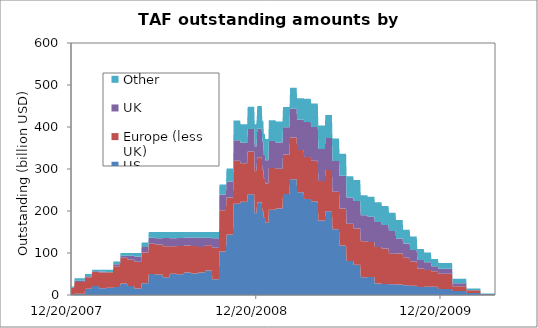
| Category | US | Europe (less UK) | UK | Other |
|---|---|---|---|---|
| 12/20/07 | 1.045 | 15.984 | 0.206 | 2.765 |
| 12/21/07 | 1.045 | 15.984 | 0.206 | 2.765 |
| 12/22/07 | 1.045 | 15.984 | 0.206 | 2.765 |
| 12/23/07 | 1.045 | 15.984 | 0.206 | 2.765 |
| 12/24/07 | 1.045 | 15.984 | 0.206 | 2.765 |
| 12/25/07 | 1.045 | 15.984 | 0.206 | 2.765 |
| 12/26/07 | 1.045 | 15.984 | 0.206 | 2.765 |
| 12/27/07 | 2.973 | 28.252 | 2.506 | 6.27 |
| 12/28/07 | 2.973 | 28.252 | 2.506 | 6.27 |
| 12/29/07 | 2.973 | 28.252 | 2.506 | 6.27 |
| 12/30/07 | 2.973 | 28.252 | 2.506 | 6.27 |
| 12/31/07 | 2.973 | 28.252 | 2.506 | 6.27 |
| 1/1/08 | 2.973 | 28.252 | 2.506 | 6.27 |
| 1/2/08 | 2.973 | 28.252 | 2.506 | 6.27 |
| 1/3/08 | 2.973 | 28.252 | 2.506 | 6.27 |
| 1/4/08 | 2.973 | 28.252 | 2.506 | 6.27 |
| 1/5/08 | 2.973 | 28.252 | 2.506 | 6.27 |
| 1/6/08 | 2.973 | 28.252 | 2.506 | 6.27 |
| 1/7/08 | 2.973 | 28.252 | 2.506 | 6.27 |
| 1/8/08 | 2.973 | 28.252 | 2.506 | 6.27 |
| 1/9/08 | 2.973 | 28.252 | 2.506 | 6.27 |
| 1/10/08 | 2.973 | 28.252 | 2.506 | 6.27 |
| 1/11/08 | 2.973 | 28.252 | 2.506 | 6.27 |
| 1/12/08 | 2.973 | 28.252 | 2.506 | 6.27 |
| 1/13/08 | 2.973 | 28.252 | 2.506 | 6.27 |
| 1/14/08 | 2.973 | 28.252 | 2.506 | 6.27 |
| 1/15/08 | 2.973 | 28.252 | 2.506 | 6.27 |
| 1/16/08 | 2.973 | 28.252 | 2.506 | 6.27 |
| 1/17/08 | 14.746 | 27.387 | 2.3 | 5.566 |
| 1/18/08 | 14.746 | 27.387 | 2.3 | 5.566 |
| 1/19/08 | 14.746 | 27.387 | 2.3 | 5.566 |
| 1/20/08 | 14.746 | 27.387 | 2.3 | 5.566 |
| 1/21/08 | 14.746 | 27.387 | 2.3 | 5.566 |
| 1/22/08 | 14.746 | 27.387 | 2.3 | 5.566 |
| 1/23/08 | 14.746 | 27.387 | 2.3 | 5.566 |
| 1/24/08 | 14.746 | 27.387 | 2.3 | 5.566 |
| 1/25/08 | 14.746 | 27.387 | 2.3 | 5.566 |
| 1/26/08 | 14.746 | 27.387 | 2.3 | 5.566 |
| 1/27/08 | 14.746 | 27.387 | 2.3 | 5.566 |
| 1/28/08 | 14.746 | 27.387 | 2.3 | 5.566 |
| 1/29/08 | 14.746 | 27.387 | 2.3 | 5.566 |
| 1/30/08 | 14.746 | 27.387 | 2.3 | 5.566 |
| 1/31/08 | 21.15 | 33.418 | 2.01 | 3.421 |
| 2/1/08 | 21.15 | 33.418 | 2.01 | 3.421 |
| 2/2/08 | 21.15 | 33.418 | 2.01 | 3.421 |
| 2/3/08 | 21.15 | 33.418 | 2.01 | 3.421 |
| 2/4/08 | 21.15 | 33.418 | 2.01 | 3.421 |
| 2/5/08 | 21.15 | 33.418 | 2.01 | 3.421 |
| 2/6/08 | 21.15 | 33.418 | 2.01 | 3.421 |
| 2/7/08 | 21.15 | 33.418 | 2.01 | 3.421 |
| 2/8/08 | 21.15 | 33.418 | 2.01 | 3.421 |
| 2/9/08 | 21.15 | 33.418 | 2.01 | 3.421 |
| 2/10/08 | 21.15 | 33.418 | 2.01 | 3.421 |
| 2/11/08 | 21.15 | 33.418 | 2.01 | 3.421 |
| 2/12/08 | 21.15 | 33.418 | 2.01 | 3.421 |
| 2/13/08 | 21.15 | 33.418 | 2.01 | 3.421 |
| 2/14/08 | 16.268 | 37.562 | 2.01 | 4.16 |
| 2/15/08 | 16.268 | 37.562 | 2.01 | 4.16 |
| 2/16/08 | 16.268 | 37.562 | 2.01 | 4.16 |
| 2/17/08 | 16.268 | 37.562 | 2.01 | 4.16 |
| 2/18/08 | 16.268 | 37.562 | 2.01 | 4.16 |
| 2/19/08 | 16.268 | 37.562 | 2.01 | 4.16 |
| 2/20/08 | 16.268 | 37.562 | 2.01 | 4.16 |
| 2/21/08 | 16.268 | 37.562 | 2.01 | 4.16 |
| 2/22/08 | 16.268 | 37.562 | 2.01 | 4.16 |
| 2/23/08 | 16.268 | 37.562 | 2.01 | 4.16 |
| 2/24/08 | 16.268 | 37.562 | 2.01 | 4.16 |
| 2/25/08 | 16.268 | 37.562 | 2.01 | 4.16 |
| 2/26/08 | 16.268 | 37.562 | 2.01 | 4.16 |
| 2/27/08 | 16.268 | 37.562 | 2.01 | 4.16 |
| 2/28/08 | 17.058 | 37.132 | 0.21 | 5.6 |
| 2/29/08 | 17.058 | 37.132 | 0.21 | 5.6 |
| 3/1/08 | 17.058 | 37.132 | 0.21 | 5.6 |
| 3/2/08 | 17.058 | 37.132 | 0.21 | 5.6 |
| 3/3/08 | 17.058 | 37.132 | 0.21 | 5.6 |
| 3/4/08 | 17.058 | 37.132 | 0.21 | 5.6 |
| 3/5/08 | 17.058 | 37.132 | 0.21 | 5.6 |
| 3/6/08 | 17.058 | 37.132 | 0.21 | 5.6 |
| 3/7/08 | 17.058 | 37.132 | 0.21 | 5.6 |
| 3/8/08 | 17.058 | 37.132 | 0.21 | 5.6 |
| 3/9/08 | 17.058 | 37.132 | 0.21 | 5.6 |
| 3/10/08 | 17.058 | 37.132 | 0.21 | 5.6 |
| 3/11/08 | 17.058 | 37.132 | 0.21 | 5.6 |
| 3/12/08 | 17.058 | 37.132 | 0.21 | 5.6 |
| 3/13/08 | 19.18 | 49.51 | 4.46 | 6.85 |
| 3/14/08 | 19.18 | 49.51 | 4.46 | 6.85 |
| 3/15/08 | 19.18 | 49.51 | 4.46 | 6.85 |
| 3/16/08 | 19.18 | 49.51 | 4.46 | 6.85 |
| 3/17/08 | 19.18 | 49.51 | 4.46 | 6.85 |
| 3/18/08 | 19.18 | 49.51 | 4.46 | 6.85 |
| 3/19/08 | 19.18 | 49.51 | 4.46 | 6.85 |
| 3/20/08 | 19.18 | 49.51 | 4.46 | 6.85 |
| 3/21/08 | 19.18 | 49.51 | 4.46 | 6.85 |
| 3/22/08 | 19.18 | 49.51 | 4.46 | 6.85 |
| 3/23/08 | 19.18 | 49.51 | 4.46 | 6.85 |
| 3/24/08 | 19.18 | 49.51 | 4.46 | 6.85 |
| 3/25/08 | 19.18 | 49.51 | 4.46 | 6.85 |
| 3/26/08 | 19.18 | 49.51 | 4.46 | 6.85 |
| 3/27/08 | 27.183 | 61.583 | 4.85 | 6.385 |
| 3/28/08 | 27.183 | 61.583 | 4.85 | 6.385 |
| 3/29/08 | 27.183 | 61.583 | 4.85 | 6.385 |
| 3/30/08 | 27.183 | 61.583 | 4.85 | 6.385 |
| 3/31/08 | 27.183 | 61.583 | 4.85 | 6.385 |
| 4/1/08 | 27.183 | 61.583 | 4.85 | 6.385 |
| 4/2/08 | 27.183 | 61.583 | 4.85 | 6.385 |
| 4/3/08 | 27.183 | 61.583 | 4.85 | 6.385 |
| 4/4/08 | 27.183 | 61.583 | 4.85 | 6.385 |
| 4/5/08 | 27.183 | 61.583 | 4.85 | 6.385 |
| 4/6/08 | 27.183 | 61.583 | 4.85 | 6.385 |
| 4/7/08 | 27.183 | 61.583 | 4.85 | 6.385 |
| 4/8/08 | 27.183 | 61.583 | 4.85 | 6.385 |
| 4/9/08 | 27.183 | 61.583 | 4.85 | 6.385 |
| 4/10/08 | 21.679 | 62.866 | 9 | 6.455 |
| 4/11/08 | 21.679 | 62.866 | 9 | 6.455 |
| 4/12/08 | 21.679 | 62.866 | 9 | 6.455 |
| 4/13/08 | 21.679 | 62.866 | 9 | 6.455 |
| 4/14/08 | 21.679 | 62.866 | 9 | 6.455 |
| 4/15/08 | 21.679 | 62.866 | 9 | 6.455 |
| 4/16/08 | 21.679 | 62.866 | 9 | 6.455 |
| 4/17/08 | 21.679 | 62.866 | 9 | 6.455 |
| 4/18/08 | 21.679 | 62.866 | 9 | 6.455 |
| 4/19/08 | 21.679 | 62.866 | 9 | 6.455 |
| 4/20/08 | 21.679 | 62.866 | 9 | 6.455 |
| 4/21/08 | 21.679 | 62.866 | 9 | 6.455 |
| 4/22/08 | 21.679 | 62.866 | 9 | 6.455 |
| 4/23/08 | 21.679 | 62.866 | 9 | 6.455 |
| 4/24/08 | 15.5 | 63.524 | 12.55 | 8.426 |
| 4/25/08 | 15.5 | 63.524 | 12.55 | 8.426 |
| 4/26/08 | 15.5 | 63.524 | 12.55 | 8.426 |
| 4/27/08 | 15.5 | 63.524 | 12.55 | 8.426 |
| 4/28/08 | 15.5 | 63.524 | 12.55 | 8.426 |
| 4/29/08 | 15.5 | 63.524 | 12.55 | 8.426 |
| 4/30/08 | 15.5 | 63.524 | 12.55 | 8.426 |
| 5/1/08 | 15.5 | 63.524 | 12.55 | 8.426 |
| 5/2/08 | 15.5 | 63.524 | 12.55 | 8.426 |
| 5/3/08 | 15.5 | 63.524 | 12.55 | 8.426 |
| 5/4/08 | 15.5 | 63.524 | 12.55 | 8.426 |
| 5/5/08 | 15.5 | 63.524 | 12.55 | 8.426 |
| 5/6/08 | 15.5 | 63.524 | 12.55 | 8.426 |
| 5/7/08 | 15.5 | 63.524 | 12.55 | 8.426 |
| 5/8/08 | 27.78 | 73.433 | 13.36 | 10.426 |
| 5/9/08 | 27.78 | 73.433 | 13.36 | 10.426 |
| 5/10/08 | 27.78 | 73.433 | 13.36 | 10.426 |
| 5/11/08 | 27.78 | 73.433 | 13.36 | 10.426 |
| 5/12/08 | 27.78 | 73.433 | 13.36 | 10.426 |
| 5/13/08 | 27.78 | 73.433 | 13.36 | 10.426 |
| 5/14/08 | 27.78 | 73.433 | 13.36 | 10.426 |
| 5/15/08 | 27.78 | 73.433 | 13.36 | 10.426 |
| 5/16/08 | 27.78 | 73.433 | 13.36 | 10.426 |
| 5/17/08 | 27.78 | 73.433 | 13.36 | 10.426 |
| 5/18/08 | 27.78 | 73.433 | 13.36 | 10.426 |
| 5/19/08 | 27.78 | 73.433 | 13.36 | 10.426 |
| 5/20/08 | 27.78 | 73.433 | 13.36 | 10.426 |
| 5/21/08 | 27.78 | 73.433 | 13.36 | 10.426 |
| 5/22/08 | 49.861 | 72.036 | 14.222 | 13.88 |
| 5/23/08 | 49.861 | 72.036 | 14.222 | 13.88 |
| 5/24/08 | 49.861 | 72.036 | 14.222 | 13.88 |
| 5/25/08 | 49.861 | 72.036 | 14.222 | 13.88 |
| 5/26/08 | 49.861 | 72.036 | 14.222 | 13.88 |
| 5/27/08 | 49.861 | 72.036 | 14.222 | 13.88 |
| 5/28/08 | 49.861 | 72.036 | 14.222 | 13.88 |
| 5/29/08 | 49.861 | 72.036 | 14.222 | 13.88 |
| 5/30/08 | 49.861 | 72.036 | 14.222 | 13.88 |
| 5/31/08 | 49.861 | 72.036 | 14.222 | 13.88 |
| 6/1/08 | 49.861 | 72.036 | 14.222 | 13.88 |
| 6/2/08 | 49.861 | 72.036 | 14.222 | 13.88 |
| 6/3/08 | 49.861 | 72.036 | 14.222 | 13.88 |
| 6/4/08 | 49.861 | 72.036 | 14.222 | 13.88 |
| 6/5/08 | 48.658 | 71.869 | 14.862 | 14.61 |
| 6/6/08 | 48.658 | 71.869 | 14.862 | 14.61 |
| 6/7/08 | 48.658 | 71.869 | 14.862 | 14.61 |
| 6/8/08 | 48.658 | 71.869 | 14.862 | 14.61 |
| 6/9/08 | 48.658 | 71.869 | 14.862 | 14.61 |
| 6/10/08 | 48.658 | 71.869 | 14.862 | 14.61 |
| 6/11/08 | 48.658 | 71.869 | 14.862 | 14.61 |
| 6/12/08 | 48.658 | 71.869 | 14.862 | 14.61 |
| 6/13/08 | 48.658 | 71.869 | 14.862 | 14.61 |
| 6/14/08 | 48.658 | 71.869 | 14.862 | 14.61 |
| 6/15/08 | 48.658 | 71.869 | 14.862 | 14.61 |
| 6/16/08 | 48.658 | 71.869 | 14.862 | 14.61 |
| 6/17/08 | 48.658 | 71.869 | 14.862 | 14.61 |
| 6/18/08 | 48.658 | 71.869 | 14.862 | 14.61 |
| 6/19/08 | 42.095 | 74.027 | 19.578 | 14.3 |
| 6/20/08 | 42.095 | 74.027 | 19.578 | 14.3 |
| 6/21/08 | 42.095 | 74.027 | 19.578 | 14.3 |
| 6/22/08 | 42.095 | 74.027 | 19.578 | 14.3 |
| 6/23/08 | 42.095 | 74.027 | 19.578 | 14.3 |
| 6/24/08 | 42.095 | 74.027 | 19.578 | 14.3 |
| 6/25/08 | 42.095 | 74.027 | 19.578 | 14.3 |
| 6/26/08 | 42.095 | 74.027 | 19.578 | 14.3 |
| 6/27/08 | 42.095 | 74.027 | 19.578 | 14.3 |
| 6/28/08 | 42.095 | 74.027 | 19.578 | 14.3 |
| 6/29/08 | 42.095 | 74.027 | 19.578 | 14.3 |
| 6/30/08 | 42.095 | 74.027 | 19.578 | 14.3 |
| 7/1/08 | 42.095 | 74.027 | 19.578 | 14.3 |
| 7/2/08 | 42.095 | 74.027 | 19.578 | 14.3 |
| 7/3/08 | 50.309 | 65.793 | 19.118 | 14.78 |
| 7/4/08 | 50.309 | 65.793 | 19.118 | 14.78 |
| 7/5/08 | 50.309 | 65.793 | 19.118 | 14.78 |
| 7/6/08 | 50.309 | 65.793 | 19.118 | 14.78 |
| 7/7/08 | 50.309 | 65.793 | 19.118 | 14.78 |
| 7/8/08 | 50.309 | 65.793 | 19.118 | 14.78 |
| 7/9/08 | 50.309 | 65.793 | 19.118 | 14.78 |
| 7/10/08 | 50.309 | 65.793 | 19.118 | 14.78 |
| 7/11/08 | 50.309 | 65.793 | 19.118 | 14.78 |
| 7/12/08 | 50.309 | 65.793 | 19.118 | 14.78 |
| 7/13/08 | 50.309 | 65.793 | 19.118 | 14.78 |
| 7/14/08 | 50.309 | 65.793 | 19.118 | 14.78 |
| 7/15/08 | 50.309 | 65.793 | 19.118 | 14.78 |
| 7/16/08 | 50.309 | 65.793 | 19.118 | 14.78 |
| 7/17/08 | 49.388 | 67.172 | 19.4 | 14.04 |
| 7/18/08 | 49.388 | 67.172 | 19.4 | 14.04 |
| 7/19/08 | 49.388 | 67.172 | 19.4 | 14.04 |
| 7/20/08 | 49.388 | 67.172 | 19.4 | 14.04 |
| 7/21/08 | 49.388 | 67.172 | 19.4 | 14.04 |
| 7/22/08 | 49.388 | 67.172 | 19.4 | 14.04 |
| 7/23/08 | 49.388 | 67.172 | 19.4 | 14.04 |
| 7/24/08 | 49.388 | 67.172 | 19.4 | 14.04 |
| 7/25/08 | 49.388 | 67.172 | 19.4 | 14.04 |
| 7/26/08 | 49.388 | 67.172 | 19.4 | 14.04 |
| 7/27/08 | 49.388 | 67.172 | 19.4 | 14.04 |
| 7/28/08 | 49.388 | 67.172 | 19.4 | 14.04 |
| 7/29/08 | 49.388 | 67.172 | 19.4 | 14.04 |
| 7/30/08 | 49.388 | 67.172 | 19.4 | 14.04 |
| 7/31/08 | 53.574 | 64.122 | 19.264 | 13.04 |
| 8/1/08 | 53.574 | 64.122 | 19.264 | 13.04 |
| 8/2/08 | 53.574 | 64.122 | 19.264 | 13.04 |
| 8/3/08 | 53.574 | 64.122 | 19.264 | 13.04 |
| 8/4/08 | 53.574 | 64.122 | 19.264 | 13.04 |
| 8/5/08 | 53.574 | 64.122 | 19.264 | 13.04 |
| 8/6/08 | 53.574 | 64.122 | 19.264 | 13.04 |
| 8/7/08 | 53.574 | 64.122 | 19.264 | 13.04 |
| 8/8/08 | 53.574 | 64.122 | 19.264 | 13.04 |
| 8/9/08 | 53.574 | 64.122 | 19.264 | 13.04 |
| 8/10/08 | 53.574 | 64.122 | 19.264 | 13.04 |
| 8/11/08 | 53.574 | 64.122 | 19.264 | 13.04 |
| 8/12/08 | 53.574 | 64.122 | 19.264 | 13.04 |
| 8/13/08 | 53.574 | 64.122 | 19.264 | 13.04 |
| 8/14/08 | 51.364 | 65.114 | 20.442 | 13.08 |
| 8/15/08 | 51.364 | 65.114 | 20.442 | 13.08 |
| 8/16/08 | 51.364 | 65.114 | 20.442 | 13.08 |
| 8/17/08 | 51.364 | 65.114 | 20.442 | 13.08 |
| 8/18/08 | 51.364 | 65.114 | 20.442 | 13.08 |
| 8/19/08 | 51.364 | 65.114 | 20.442 | 13.08 |
| 8/20/08 | 51.364 | 65.114 | 20.442 | 13.08 |
| 8/21/08 | 51.364 | 65.114 | 20.442 | 13.08 |
| 8/22/08 | 51.364 | 65.114 | 20.442 | 13.08 |
| 8/23/08 | 51.364 | 65.114 | 20.442 | 13.08 |
| 8/24/08 | 51.364 | 65.114 | 20.442 | 13.08 |
| 8/25/08 | 51.364 | 65.114 | 20.442 | 13.08 |
| 8/26/08 | 51.364 | 65.114 | 20.442 | 13.08 |
| 8/27/08 | 51.364 | 65.114 | 20.442 | 13.08 |
| 8/28/08 | 53.677 | 60.43 | 21.988 | 13.905 |
| 8/29/08 | 53.677 | 60.43 | 21.988 | 13.905 |
| 8/30/08 | 53.677 | 60.43 | 21.988 | 13.905 |
| 8/31/08 | 53.677 | 60.43 | 21.988 | 13.905 |
| 9/1/08 | 53.677 | 60.43 | 21.988 | 13.905 |
| 9/2/08 | 53.677 | 60.43 | 21.988 | 13.905 |
| 9/3/08 | 53.677 | 60.43 | 21.988 | 13.905 |
| 9/4/08 | 53.677 | 60.43 | 21.988 | 13.905 |
| 9/5/08 | 53.677 | 60.43 | 21.988 | 13.905 |
| 9/6/08 | 53.677 | 60.43 | 21.988 | 13.905 |
| 9/7/08 | 53.677 | 60.43 | 21.988 | 13.905 |
| 9/8/08 | 53.677 | 60.43 | 21.988 | 13.905 |
| 9/9/08 | 53.677 | 60.43 | 21.988 | 13.905 |
| 9/10/08 | 53.677 | 60.43 | 21.988 | 13.905 |
| 9/11/08 | 58.205 | 60.28 | 17.9 | 13.615 |
| 9/12/08 | 58.205 | 60.28 | 17.9 | 13.615 |
| 9/13/08 | 58.205 | 60.28 | 17.9 | 13.615 |
| 9/14/08 | 58.205 | 60.28 | 17.9 | 13.615 |
| 9/15/08 | 58.205 | 60.28 | 17.9 | 13.615 |
| 9/16/08 | 58.205 | 60.28 | 17.9 | 13.615 |
| 9/17/08 | 58.205 | 60.28 | 17.9 | 13.615 |
| 9/18/08 | 58.205 | 60.28 | 17.9 | 13.615 |
| 9/19/08 | 58.205 | 60.28 | 17.9 | 13.615 |
| 9/20/08 | 58.205 | 60.28 | 17.9 | 13.615 |
| 9/21/08 | 58.205 | 60.28 | 17.9 | 13.615 |
| 9/22/08 | 58.205 | 60.28 | 17.9 | 13.615 |
| 9/23/08 | 58.205 | 60.28 | 17.9 | 13.615 |
| 9/24/08 | 58.205 | 60.28 | 17.9 | 13.615 |
| 9/25/08 | 37.665 | 75 | 22.162 | 15.173 |
| 9/26/08 | 37.665 | 75 | 22.162 | 15.173 |
| 9/27/08 | 37.665 | 75 | 22.162 | 15.173 |
| 9/28/08 | 37.665 | 75 | 22.162 | 15.173 |
| 9/29/08 | 37.665 | 75 | 22.162 | 15.173 |
| 9/30/08 | 37.665 | 75 | 22.162 | 15.173 |
| 10/1/08 | 37.665 | 75 | 22.162 | 15.173 |
| 10/2/08 | 37.665 | 75 | 22.162 | 15.173 |
| 10/3/08 | 37.665 | 75 | 22.162 | 15.173 |
| 10/4/08 | 37.665 | 75 | 22.162 | 15.173 |
| 10/5/08 | 37.665 | 75 | 22.162 | 15.173 |
| 10/6/08 | 37.665 | 75 | 22.162 | 15.173 |
| 10/7/08 | 37.665 | 75 | 22.162 | 15.173 |
| 10/8/08 | 37.665 | 75 | 22.162 | 15.173 |
| 10/9/08 | 103.707 | 97.8 | 37.562 | 24.023 |
| 10/10/08 | 103.707 | 97.8 | 37.562 | 24.023 |
| 10/11/08 | 103.707 | 97.8 | 37.562 | 24.023 |
| 10/12/08 | 103.707 | 97.8 | 37.562 | 24.023 |
| 10/13/08 | 103.707 | 97.8 | 37.562 | 24.023 |
| 10/14/08 | 103.707 | 97.8 | 37.562 | 24.023 |
| 10/15/08 | 103.707 | 97.8 | 37.562 | 24.023 |
| 10/16/08 | 103.707 | 97.8 | 37.562 | 24.023 |
| 10/17/08 | 103.707 | 97.8 | 37.562 | 24.023 |
| 10/18/08 | 103.707 | 97.8 | 37.562 | 24.023 |
| 10/19/08 | 103.707 | 97.8 | 37.562 | 24.023 |
| 10/20/08 | 103.707 | 97.8 | 37.562 | 24.023 |
| 10/21/08 | 103.707 | 97.8 | 37.562 | 24.023 |
| 10/22/08 | 103.707 | 97.8 | 37.562 | 24.023 |
| 10/23/08 | 144.184 | 88.055 | 37.91 | 31.213 |
| 10/24/08 | 144.184 | 88.055 | 37.91 | 31.213 |
| 10/25/08 | 144.184 | 88.055 | 37.91 | 31.213 |
| 10/26/08 | 144.184 | 88.055 | 37.91 | 31.213 |
| 10/27/08 | 144.184 | 88.055 | 37.91 | 31.213 |
| 10/28/08 | 144.184 | 88.055 | 37.91 | 31.213 |
| 10/29/08 | 144.184 | 88.055 | 37.91 | 31.213 |
| 10/30/08 | 144.184 | 88.055 | 37.91 | 31.213 |
| 10/31/08 | 144.184 | 88.055 | 37.91 | 31.213 |
| 11/1/08 | 144.184 | 88.055 | 37.91 | 31.213 |
| 11/2/08 | 144.184 | 88.055 | 37.91 | 31.213 |
| 11/3/08 | 144.184 | 88.055 | 37.91 | 31.213 |
| 11/4/08 | 144.184 | 88.055 | 37.91 | 31.213 |
| 11/5/08 | 144.184 | 88.055 | 37.91 | 31.213 |
| 11/6/08 | 217.339 | 102.125 | 49.12 | 46.718 |
| 11/7/08 | 217.339 | 102.125 | 49.12 | 46.718 |
| 11/8/08 | 217.339 | 102.125 | 49.12 | 46.718 |
| 11/9/08 | 217.339 | 102.125 | 49.12 | 46.718 |
| 11/10/08 | 217.339 | 102.125 | 49.12 | 46.718 |
| 11/11/08 | 217.339 | 102.125 | 49.12 | 46.718 |
| 11/12/08 | 217.339 | 102.125 | 49.12 | 46.718 |
| 11/13/08 | 217.339 | 102.125 | 49.12 | 46.718 |
| 11/14/08 | 217.339 | 102.125 | 49.12 | 46.718 |
| 11/15/08 | 217.339 | 102.125 | 49.12 | 46.718 |
| 11/16/08 | 217.339 | 102.125 | 49.12 | 46.718 |
| 11/17/08 | 217.339 | 102.125 | 49.12 | 46.718 |
| 11/18/08 | 217.339 | 102.125 | 49.12 | 46.718 |
| 11/19/08 | 217.339 | 102.125 | 49.12 | 46.718 |
| 11/20/08 | 221.873 | 91.975 | 48.62 | 44.04 |
| 11/21/08 | 221.873 | 91.975 | 48.62 | 44.04 |
| 11/22/08 | 221.873 | 91.975 | 48.62 | 44.04 |
| 11/23/08 | 221.873 | 91.975 | 48.62 | 44.04 |
| 11/24/08 | 221.873 | 91.975 | 48.62 | 44.04 |
| 11/25/08 | 221.873 | 91.975 | 48.62 | 44.04 |
| 11/26/08 | 221.873 | 91.975 | 48.62 | 44.04 |
| 11/27/08 | 221.873 | 91.975 | 48.62 | 44.04 |
| 11/28/08 | 221.873 | 91.975 | 48.62 | 44.04 |
| 11/29/08 | 221.873 | 91.975 | 48.62 | 44.04 |
| 11/30/08 | 221.873 | 91.975 | 48.62 | 44.04 |
| 12/1/08 | 221.873 | 91.975 | 48.62 | 44.04 |
| 12/2/08 | 221.873 | 91.975 | 48.62 | 44.04 |
| 12/3/08 | 221.873 | 91.975 | 48.62 | 44.04 |
| 12/4/08 | 239.679 | 101.925 | 53.52 | 52.855 |
| 12/5/08 | 239.679 | 101.925 | 53.52 | 52.855 |
| 12/6/08 | 239.679 | 101.925 | 53.52 | 52.855 |
| 12/7/08 | 239.679 | 101.925 | 53.52 | 52.855 |
| 12/8/08 | 239.679 | 101.925 | 53.52 | 52.855 |
| 12/9/08 | 239.679 | 101.925 | 53.52 | 52.855 |
| 12/10/08 | 239.679 | 101.925 | 53.52 | 52.855 |
| 12/11/08 | 239.679 | 101.925 | 53.52 | 52.855 |
| 12/12/08 | 239.679 | 101.925 | 53.52 | 52.855 |
| 12/13/08 | 239.679 | 101.925 | 53.52 | 52.855 |
| 12/14/08 | 239.679 | 101.925 | 53.52 | 52.855 |
| 12/15/08 | 239.679 | 101.925 | 53.52 | 52.855 |
| 12/16/08 | 239.679 | 101.925 | 53.52 | 52.855 |
| 12/17/08 | 239.679 | 101.925 | 53.52 | 52.855 |
| 12/18/08 | 193.277 | 101.261 | 57.8 | 54.176 |
| 12/19/08 | 193.277 | 101.261 | 57.8 | 54.176 |
| 12/20/08 | 193.277 | 101.261 | 57.8 | 54.176 |
| 12/21/08 | 193.277 | 101.261 | 57.8 | 54.176 |
| 12/22/08 | 205.306 | 101.761 | 57.8 | 54.276 |
| 12/23/08 | 220.671 | 107.271 | 67.8 | 54.476 |
| 12/24/08 | 220.671 | 107.271 | 67.8 | 54.476 |
| 12/25/08 | 220.671 | 107.271 | 67.8 | 54.476 |
| 12/26/08 | 220.671 | 107.271 | 67.8 | 54.476 |
| 12/27/08 | 220.671 | 107.271 | 67.8 | 54.476 |
| 12/28/08 | 220.671 | 107.271 | 67.8 | 54.476 |
| 12/29/08 | 220.671 | 107.271 | 67.8 | 54.476 |
| 12/30/08 | 220.671 | 107.271 | 67.8 | 54.476 |
| 12/31/08 | 220.671 | 107.271 | 67.8 | 54.476 |
| 1/1/09 | 220.671 | 107.271 | 67.8 | 54.476 |
| 1/2/09 | 199.615 | 98.971 | 65.58 | 50.94 |
| 1/3/09 | 199.615 | 98.971 | 65.58 | 50.94 |
| 1/4/09 | 199.615 | 98.971 | 65.58 | 50.94 |
| 1/5/09 | 184.25 | 93.461 | 55.58 | 50.74 |
| 1/6/09 | 184.25 | 93.461 | 55.58 | 50.74 |
| 1/7/09 | 184.25 | 93.461 | 55.58 | 50.74 |
| 1/8/09 | 172.221 | 92.961 | 55.58 | 50.64 |
| 1/9/09 | 172.221 | 92.961 | 55.58 | 50.64 |
| 1/10/09 | 172.221 | 92.961 | 55.58 | 50.64 |
| 1/11/09 | 172.221 | 92.961 | 55.58 | 50.64 |
| 1/12/09 | 172.221 | 92.961 | 55.58 | 50.64 |
| 1/13/09 | 172.221 | 92.961 | 55.58 | 50.64 |
| 1/14/09 | 172.221 | 92.961 | 55.58 | 50.64 |
| 1/15/09 | 202.76 | 99.513 | 64.4 | 49.463 |
| 1/16/09 | 202.76 | 99.513 | 64.4 | 49.463 |
| 1/17/09 | 202.76 | 99.513 | 64.4 | 49.463 |
| 1/18/09 | 202.76 | 99.513 | 64.4 | 49.463 |
| 1/19/09 | 202.76 | 99.513 | 64.4 | 49.463 |
| 1/20/09 | 202.76 | 99.513 | 64.4 | 49.463 |
| 1/21/09 | 202.76 | 99.513 | 64.4 | 49.463 |
| 1/22/09 | 202.76 | 99.513 | 64.4 | 49.463 |
| 1/23/09 | 202.76 | 99.513 | 64.4 | 49.463 |
| 1/24/09 | 202.76 | 99.513 | 64.4 | 49.463 |
| 1/25/09 | 202.76 | 99.513 | 64.4 | 49.463 |
| 1/26/09 | 202.76 | 99.513 | 64.4 | 49.463 |
| 1/27/09 | 202.76 | 99.513 | 64.4 | 49.463 |
| 1/28/09 | 202.76 | 99.513 | 64.4 | 49.463 |
| 1/29/09 | 205.84 | 94.663 | 62.735 | 50.01 |
| 1/30/09 | 205.84 | 94.663 | 62.735 | 50.01 |
| 1/31/09 | 205.84 | 94.663 | 62.735 | 50.01 |
| 2/1/09 | 205.84 | 94.663 | 62.735 | 50.01 |
| 2/2/09 | 205.84 | 94.663 | 62.735 | 50.01 |
| 2/3/09 | 205.84 | 94.663 | 62.735 | 50.01 |
| 2/4/09 | 205.84 | 94.663 | 62.735 | 50.01 |
| 2/5/09 | 205.84 | 94.663 | 62.735 | 50.01 |
| 2/6/09 | 205.84 | 94.663 | 62.735 | 50.01 |
| 2/7/09 | 205.84 | 94.663 | 62.735 | 50.01 |
| 2/8/09 | 205.84 | 94.663 | 62.735 | 50.01 |
| 2/9/09 | 205.84 | 94.663 | 62.735 | 50.01 |
| 2/10/09 | 205.84 | 94.663 | 62.735 | 50.01 |
| 2/11/09 | 205.84 | 94.663 | 62.735 | 50.01 |
| 2/12/09 | 240.368 | 94.191 | 64.735 | 48.534 |
| 2/13/09 | 240.368 | 94.191 | 64.735 | 48.534 |
| 2/14/09 | 240.368 | 94.191 | 64.735 | 48.534 |
| 2/15/09 | 240.368 | 94.191 | 64.735 | 48.534 |
| 2/16/09 | 240.368 | 94.191 | 64.735 | 48.534 |
| 2/17/09 | 240.368 | 94.191 | 64.735 | 48.534 |
| 2/18/09 | 240.368 | 94.191 | 64.735 | 48.534 |
| 2/19/09 | 240.368 | 94.191 | 64.735 | 48.534 |
| 2/20/09 | 240.368 | 94.191 | 64.735 | 48.534 |
| 2/21/09 | 240.368 | 94.191 | 64.735 | 48.534 |
| 2/22/09 | 240.368 | 94.191 | 64.735 | 48.534 |
| 2/23/09 | 240.368 | 94.191 | 64.735 | 48.534 |
| 2/24/09 | 240.368 | 94.191 | 64.735 | 48.534 |
| 2/25/09 | 240.368 | 94.191 | 64.735 | 48.534 |
| 2/26/09 | 275.571 | 99.251 | 68.535 | 49.813 |
| 2/27/09 | 275.571 | 99.251 | 68.535 | 49.813 |
| 2/28/09 | 275.571 | 99.251 | 68.535 | 49.813 |
| 3/1/09 | 275.571 | 99.251 | 68.535 | 49.813 |
| 3/2/09 | 275.571 | 99.251 | 68.535 | 49.813 |
| 3/3/09 | 275.571 | 99.251 | 68.535 | 49.813 |
| 3/4/09 | 275.571 | 99.251 | 68.535 | 49.813 |
| 3/5/09 | 275.571 | 99.251 | 68.535 | 49.813 |
| 3/6/09 | 275.571 | 99.251 | 68.535 | 49.813 |
| 3/7/09 | 275.571 | 99.251 | 68.535 | 49.813 |
| 3/8/09 | 275.571 | 99.251 | 68.535 | 49.813 |
| 3/9/09 | 275.571 | 99.251 | 68.535 | 49.813 |
| 3/10/09 | 275.571 | 99.251 | 68.535 | 49.813 |
| 3/11/09 | 275.571 | 99.251 | 68.535 | 49.813 |
| 3/12/09 | 244.925 | 100.171 | 72.035 | 51.484 |
| 3/13/09 | 244.925 | 100.171 | 72.035 | 51.484 |
| 3/14/09 | 244.925 | 100.171 | 72.035 | 51.484 |
| 3/15/09 | 244.925 | 100.171 | 72.035 | 51.484 |
| 3/16/09 | 244.925 | 100.171 | 72.035 | 51.484 |
| 3/17/09 | 244.925 | 100.171 | 72.035 | 51.484 |
| 3/18/09 | 244.925 | 100.171 | 72.035 | 51.484 |
| 3/19/09 | 244.925 | 100.171 | 72.035 | 51.484 |
| 3/20/09 | 244.925 | 100.171 | 72.035 | 51.484 |
| 3/21/09 | 244.925 | 100.171 | 72.035 | 51.484 |
| 3/22/09 | 244.925 | 100.171 | 72.035 | 51.484 |
| 3/23/09 | 244.925 | 100.171 | 72.035 | 51.484 |
| 3/24/09 | 244.925 | 100.171 | 72.035 | 51.484 |
| 3/25/09 | 244.925 | 100.171 | 72.035 | 51.484 |
| 3/26/09 | 228.582 | 99.831 | 83.455 | 55.41 |
| 3/27/09 | 228.582 | 99.831 | 83.455 | 55.41 |
| 3/28/09 | 228.582 | 99.831 | 83.455 | 55.41 |
| 3/29/09 | 228.582 | 99.831 | 83.455 | 55.41 |
| 3/30/09 | 228.582 | 99.831 | 83.455 | 55.41 |
| 3/31/09 | 228.582 | 99.831 | 83.455 | 55.41 |
| 4/1/09 | 228.582 | 99.831 | 83.455 | 55.41 |
| 4/2/09 | 228.582 | 99.831 | 83.455 | 55.41 |
| 4/3/09 | 228.582 | 99.831 | 83.455 | 55.41 |
| 4/4/09 | 228.582 | 99.831 | 83.455 | 55.41 |
| 4/5/09 | 228.582 | 99.831 | 83.455 | 55.41 |
| 4/6/09 | 228.582 | 99.831 | 83.455 | 55.41 |
| 4/7/09 | 228.582 | 99.831 | 83.455 | 55.41 |
| 4/8/09 | 228.582 | 99.831 | 83.455 | 55.41 |
| 4/9/09 | 222.884 | 96.506 | 80.405 | 56.011 |
| 4/10/09 | 222.884 | 96.506 | 80.405 | 56.011 |
| 4/11/09 | 222.884 | 96.506 | 80.405 | 56.011 |
| 4/12/09 | 222.884 | 96.506 | 80.405 | 56.011 |
| 4/13/09 | 222.884 | 96.506 | 80.405 | 56.011 |
| 4/14/09 | 222.884 | 96.506 | 80.405 | 56.011 |
| 4/15/09 | 222.884 | 96.506 | 80.405 | 56.011 |
| 4/16/09 | 222.884 | 96.506 | 80.405 | 56.011 |
| 4/17/09 | 222.884 | 96.506 | 80.405 | 56.011 |
| 4/18/09 | 222.884 | 96.506 | 80.405 | 56.011 |
| 4/19/09 | 222.884 | 96.506 | 80.405 | 56.011 |
| 4/20/09 | 222.884 | 96.506 | 80.405 | 56.011 |
| 4/21/09 | 222.884 | 96.506 | 80.405 | 56.011 |
| 4/22/09 | 222.884 | 96.506 | 80.405 | 56.011 |
| 4/23/09 | 177.128 | 94.031 | 76.478 | 55.948 |
| 4/24/09 | 177.128 | 94.031 | 76.478 | 55.948 |
| 4/25/09 | 177.128 | 94.031 | 76.478 | 55.948 |
| 4/26/09 | 177.128 | 94.031 | 76.478 | 55.948 |
| 4/27/09 | 177.128 | 94.031 | 76.478 | 55.948 |
| 4/28/09 | 177.128 | 94.031 | 76.478 | 55.948 |
| 4/29/09 | 177.128 | 94.031 | 76.478 | 55.948 |
| 4/30/09 | 177.128 | 94.031 | 76.478 | 55.948 |
| 5/1/09 | 177.128 | 94.031 | 76.478 | 55.948 |
| 5/2/09 | 177.128 | 94.031 | 76.478 | 55.948 |
| 5/3/09 | 177.128 | 94.031 | 76.478 | 55.948 |
| 5/4/09 | 177.128 | 94.031 | 76.478 | 55.948 |
| 5/5/09 | 177.128 | 94.031 | 76.478 | 55.948 |
| 5/6/09 | 177.128 | 94.031 | 76.478 | 55.948 |
| 5/7/09 | 199.116 | 98.491 | 76.488 | 54.752 |
| 5/8/09 | 199.116 | 98.491 | 76.488 | 54.752 |
| 5/9/09 | 199.116 | 98.491 | 76.488 | 54.752 |
| 5/10/09 | 199.116 | 98.491 | 76.488 | 54.752 |
| 5/11/09 | 199.116 | 98.491 | 76.488 | 54.752 |
| 5/12/09 | 199.116 | 98.491 | 76.488 | 54.752 |
| 5/13/09 | 199.116 | 98.491 | 76.488 | 54.752 |
| 5/14/09 | 199.116 | 98.491 | 76.488 | 54.752 |
| 5/15/09 | 199.116 | 98.491 | 76.488 | 54.752 |
| 5/16/09 | 199.116 | 98.491 | 76.488 | 54.752 |
| 5/17/09 | 199.116 | 98.491 | 76.488 | 54.752 |
| 5/18/09 | 199.116 | 98.491 | 76.488 | 54.752 |
| 5/19/09 | 199.116 | 98.491 | 76.488 | 54.752 |
| 5/20/09 | 199.116 | 98.491 | 76.488 | 54.752 |
| 5/21/09 | 156.675 | 89.241 | 73.208 | 53.427 |
| 5/22/09 | 156.675 | 89.241 | 73.208 | 53.427 |
| 5/23/09 | 156.675 | 89.241 | 73.208 | 53.427 |
| 5/24/09 | 156.675 | 89.241 | 73.208 | 53.427 |
| 5/25/09 | 156.675 | 89.241 | 73.208 | 53.427 |
| 5/26/09 | 156.675 | 89.241 | 73.208 | 53.427 |
| 5/27/09 | 156.675 | 89.241 | 73.208 | 53.427 |
| 5/28/09 | 156.675 | 89.241 | 73.208 | 53.427 |
| 5/29/09 | 156.675 | 89.241 | 73.208 | 53.427 |
| 5/30/09 | 156.675 | 89.241 | 73.208 | 53.427 |
| 5/31/09 | 156.675 | 89.241 | 73.208 | 53.427 |
| 6/1/09 | 156.675 | 89.241 | 73.208 | 53.427 |
| 6/2/09 | 156.675 | 89.241 | 73.208 | 53.427 |
| 6/3/09 | 156.675 | 89.241 | 73.208 | 53.427 |
| 6/4/09 | 117.751 | 88.395 | 77.758 | 52.673 |
| 6/5/09 | 117.751 | 88.395 | 77.758 | 52.673 |
| 6/6/09 | 117.751 | 88.395 | 77.758 | 52.673 |
| 6/7/09 | 117.751 | 88.395 | 77.758 | 52.673 |
| 6/8/09 | 117.751 | 88.395 | 77.758 | 52.673 |
| 6/9/09 | 117.751 | 88.395 | 77.758 | 52.673 |
| 6/10/09 | 117.751 | 88.395 | 77.758 | 52.673 |
| 6/11/09 | 117.751 | 88.395 | 77.758 | 52.673 |
| 6/12/09 | 117.751 | 88.395 | 77.758 | 52.673 |
| 6/13/09 | 117.751 | 88.395 | 77.758 | 52.673 |
| 6/14/09 | 117.751 | 88.395 | 77.758 | 52.673 |
| 6/15/09 | 117.751 | 88.395 | 77.758 | 52.673 |
| 6/16/09 | 117.751 | 88.395 | 77.758 | 52.673 |
| 6/17/09 | 117.751 | 88.395 | 77.758 | 52.673 |
| 6/18/09 | 80.886 | 88.935 | 62.308 | 50.829 |
| 6/19/09 | 80.886 | 88.935 | 62.308 | 50.829 |
| 6/20/09 | 80.886 | 88.935 | 62.308 | 50.829 |
| 6/21/09 | 80.886 | 88.935 | 62.308 | 50.829 |
| 6/22/09 | 80.886 | 88.935 | 62.308 | 50.829 |
| 6/23/09 | 80.886 | 88.935 | 62.308 | 50.829 |
| 6/24/09 | 80.886 | 88.935 | 62.308 | 50.829 |
| 6/25/09 | 80.886 | 88.935 | 62.308 | 50.829 |
| 6/26/09 | 80.886 | 88.935 | 62.308 | 50.829 |
| 6/27/09 | 80.886 | 88.935 | 62.308 | 50.829 |
| 6/28/09 | 80.886 | 88.935 | 62.308 | 50.829 |
| 6/29/09 | 80.886 | 88.935 | 62.308 | 50.829 |
| 6/30/09 | 80.886 | 88.935 | 62.308 | 50.829 |
| 7/1/09 | 80.886 | 88.935 | 62.308 | 50.829 |
| 7/2/09 | 72.074 | 86.385 | 65.233 | 50.014 |
| 7/3/09 | 72.074 | 86.385 | 65.233 | 50.014 |
| 7/4/09 | 72.074 | 86.385 | 65.233 | 50.014 |
| 7/5/09 | 72.074 | 86.385 | 65.233 | 50.014 |
| 7/6/09 | 72.074 | 86.385 | 65.233 | 50.014 |
| 7/7/09 | 72.074 | 86.385 | 65.233 | 50.014 |
| 7/8/09 | 72.074 | 86.385 | 65.233 | 50.014 |
| 7/9/09 | 72.074 | 86.385 | 65.233 | 50.014 |
| 7/10/09 | 72.074 | 86.385 | 65.233 | 50.014 |
| 7/11/09 | 72.074 | 86.385 | 65.233 | 50.014 |
| 7/12/09 | 72.074 | 86.385 | 65.233 | 50.014 |
| 7/13/09 | 72.074 | 86.385 | 65.233 | 50.014 |
| 7/14/09 | 72.074 | 86.385 | 65.233 | 50.014 |
| 7/15/09 | 72.074 | 86.385 | 65.233 | 50.014 |
| 7/16/09 | 42.078 | 85.705 | 62.265 | 47.596 |
| 7/17/09 | 42.078 | 85.705 | 62.265 | 47.596 |
| 7/18/09 | 42.078 | 85.705 | 62.265 | 47.596 |
| 7/19/09 | 42.078 | 85.705 | 62.265 | 47.596 |
| 7/20/09 | 42.078 | 85.705 | 62.265 | 47.596 |
| 7/21/09 | 42.078 | 85.705 | 62.265 | 47.596 |
| 7/22/09 | 42.078 | 85.705 | 62.265 | 47.596 |
| 7/23/09 | 42.078 | 85.705 | 62.265 | 47.596 |
| 7/24/09 | 42.078 | 85.705 | 62.265 | 47.596 |
| 7/25/09 | 42.078 | 85.705 | 62.265 | 47.596 |
| 7/26/09 | 42.078 | 85.705 | 62.265 | 47.596 |
| 7/27/09 | 42.078 | 85.705 | 62.265 | 47.596 |
| 7/28/09 | 42.078 | 85.705 | 62.265 | 47.596 |
| 7/29/09 | 42.078 | 85.705 | 62.265 | 47.596 |
| 7/30/09 | 42.839 | 83.205 | 60.43 | 47.209 |
| 7/31/09 | 42.839 | 83.205 | 60.43 | 47.209 |
| 8/1/09 | 42.839 | 83.205 | 60.43 | 47.209 |
| 8/2/09 | 42.839 | 83.205 | 60.43 | 47.209 |
| 8/3/09 | 42.839 | 83.205 | 60.43 | 47.209 |
| 8/4/09 | 42.839 | 83.205 | 60.43 | 47.209 |
| 8/5/09 | 42.839 | 83.205 | 60.43 | 47.209 |
| 8/6/09 | 42.839 | 83.205 | 60.43 | 47.209 |
| 8/7/09 | 42.839 | 83.205 | 60.43 | 47.209 |
| 8/8/09 | 42.839 | 83.205 | 60.43 | 47.209 |
| 8/9/09 | 42.839 | 83.205 | 60.43 | 47.209 |
| 8/10/09 | 42.839 | 83.205 | 60.43 | 47.209 |
| 8/11/09 | 42.839 | 83.205 | 60.43 | 47.209 |
| 8/12/09 | 42.839 | 83.205 | 60.43 | 47.209 |
| 8/13/09 | 27.25 | 86.9 | 59.736 | 47.22 |
| 8/14/09 | 27.25 | 86.9 | 59.736 | 47.22 |
| 8/15/09 | 27.25 | 86.9 | 59.736 | 47.22 |
| 8/16/09 | 27.25 | 86.9 | 59.736 | 47.22 |
| 8/17/09 | 27.25 | 86.9 | 59.736 | 47.22 |
| 8/18/09 | 27.25 | 86.9 | 59.736 | 47.22 |
| 8/19/09 | 27.25 | 86.9 | 59.736 | 47.22 |
| 8/20/09 | 27.25 | 86.9 | 59.736 | 47.22 |
| 8/21/09 | 27.25 | 86.9 | 59.736 | 47.22 |
| 8/22/09 | 27.25 | 86.9 | 59.736 | 47.22 |
| 8/23/09 | 27.25 | 86.9 | 59.736 | 47.22 |
| 8/24/09 | 27.25 | 86.9 | 59.736 | 47.22 |
| 8/25/09 | 27.25 | 86.9 | 59.736 | 47.22 |
| 8/26/09 | 27.25 | 86.9 | 59.736 | 47.22 |
| 8/27/09 | 26.002 | 84.52 | 56.096 | 45.517 |
| 8/28/09 | 26.002 | 84.52 | 56.096 | 45.517 |
| 8/29/09 | 26.002 | 84.52 | 56.096 | 45.517 |
| 8/30/09 | 26.002 | 84.52 | 56.096 | 45.517 |
| 8/31/09 | 26.002 | 84.52 | 56.096 | 45.517 |
| 9/1/09 | 26.002 | 84.52 | 56.096 | 45.517 |
| 9/2/09 | 26.002 | 84.52 | 56.096 | 45.517 |
| 9/3/09 | 26.002 | 84.52 | 56.096 | 45.517 |
| 9/4/09 | 26.002 | 84.52 | 56.096 | 45.517 |
| 9/5/09 | 26.002 | 84.52 | 56.096 | 45.517 |
| 9/6/09 | 26.002 | 84.52 | 56.096 | 45.517 |
| 9/7/09 | 26.002 | 84.52 | 56.096 | 45.517 |
| 9/8/09 | 26.002 | 84.52 | 56.096 | 45.517 |
| 9/9/09 | 26.002 | 84.52 | 56.096 | 45.517 |
| 9/10/09 | 25.375 | 73.12 | 54.107 | 43.418 |
| 9/11/09 | 25.375 | 73.12 | 54.107 | 43.418 |
| 9/12/09 | 25.375 | 73.12 | 54.107 | 43.418 |
| 9/13/09 | 25.375 | 73.12 | 54.107 | 43.418 |
| 9/14/09 | 25.375 | 73.12 | 54.107 | 43.418 |
| 9/15/09 | 25.375 | 73.12 | 54.107 | 43.418 |
| 9/16/09 | 25.375 | 73.12 | 54.107 | 43.418 |
| 9/17/09 | 25.375 | 73.12 | 54.107 | 43.418 |
| 9/18/09 | 25.375 | 73.12 | 54.107 | 43.418 |
| 9/19/09 | 25.375 | 73.12 | 54.107 | 43.418 |
| 9/20/09 | 25.375 | 73.12 | 54.107 | 43.418 |
| 9/21/09 | 25.375 | 73.12 | 54.107 | 43.418 |
| 9/22/09 | 25.375 | 73.12 | 54.107 | 43.418 |
| 9/23/09 | 25.375 | 73.12 | 54.107 | 43.418 |
| 9/24/09 | 24.861 | 74.23 | 35.687 | 43.601 |
| 9/25/09 | 24.861 | 74.23 | 35.687 | 43.601 |
| 9/26/09 | 24.861 | 74.23 | 35.687 | 43.601 |
| 9/27/09 | 24.861 | 74.23 | 35.687 | 43.601 |
| 9/28/09 | 24.861 | 74.23 | 35.687 | 43.601 |
| 9/29/09 | 24.861 | 74.23 | 35.687 | 43.601 |
| 9/30/09 | 24.861 | 74.23 | 35.687 | 43.601 |
| 10/1/09 | 24.861 | 74.23 | 35.687 | 43.601 |
| 10/2/09 | 24.861 | 74.23 | 35.687 | 43.601 |
| 10/3/09 | 24.861 | 74.23 | 35.687 | 43.601 |
| 10/4/09 | 24.861 | 74.23 | 35.687 | 43.601 |
| 10/5/09 | 24.861 | 74.23 | 35.687 | 43.601 |
| 10/6/09 | 24.861 | 74.23 | 35.687 | 43.601 |
| 10/7/09 | 24.861 | 74.23 | 35.687 | 43.601 |
| 10/8/09 | 23.345 | 65.105 | 34.037 | 32.955 |
| 10/9/09 | 23.345 | 65.105 | 34.037 | 32.955 |
| 10/10/09 | 23.345 | 65.105 | 34.037 | 32.955 |
| 10/11/09 | 23.345 | 65.105 | 34.037 | 32.955 |
| 10/12/09 | 23.345 | 65.105 | 34.037 | 32.955 |
| 10/13/09 | 23.345 | 65.105 | 34.037 | 32.955 |
| 10/14/09 | 23.345 | 65.105 | 34.037 | 32.955 |
| 10/15/09 | 23.345 | 65.105 | 34.037 | 32.955 |
| 10/16/09 | 23.345 | 65.105 | 34.037 | 32.955 |
| 10/17/09 | 23.345 | 65.105 | 34.037 | 32.955 |
| 10/18/09 | 23.345 | 65.105 | 34.037 | 32.955 |
| 10/19/09 | 23.345 | 65.105 | 34.037 | 32.955 |
| 10/20/09 | 23.345 | 65.105 | 34.037 | 32.955 |
| 10/21/09 | 23.345 | 65.105 | 34.037 | 32.955 |
| 10/22/09 | 21.926 | 57.815 | 27.537 | 31.967 |
| 10/23/09 | 21.926 | 57.815 | 27.537 | 31.967 |
| 10/24/09 | 21.926 | 57.815 | 27.537 | 31.967 |
| 10/25/09 | 21.926 | 57.815 | 27.537 | 31.967 |
| 10/26/09 | 21.926 | 57.815 | 27.537 | 31.967 |
| 10/27/09 | 21.926 | 57.815 | 27.537 | 31.967 |
| 10/28/09 | 21.926 | 57.815 | 27.537 | 31.967 |
| 10/29/09 | 21.926 | 57.815 | 27.537 | 31.967 |
| 10/30/09 | 21.926 | 57.815 | 27.537 | 31.967 |
| 10/31/09 | 21.926 | 57.815 | 27.537 | 31.967 |
| 11/1/09 | 21.926 | 57.815 | 27.537 | 31.967 |
| 11/2/09 | 21.926 | 57.815 | 27.537 | 31.967 |
| 11/3/09 | 21.926 | 57.815 | 27.537 | 31.967 |
| 11/4/09 | 21.926 | 57.815 | 27.537 | 31.967 |
| 11/5/09 | 18.953 | 44.31 | 20.111 | 26.082 |
| 11/6/09 | 18.953 | 44.31 | 20.111 | 26.082 |
| 11/7/09 | 18.953 | 44.31 | 20.111 | 26.082 |
| 11/8/09 | 18.953 | 44.31 | 20.111 | 26.082 |
| 11/9/09 | 18.953 | 44.31 | 20.111 | 26.082 |
| 11/10/09 | 18.953 | 44.31 | 20.111 | 26.082 |
| 11/11/09 | 18.953 | 44.31 | 20.111 | 26.082 |
| 11/12/09 | 18.953 | 44.31 | 20.111 | 26.082 |
| 11/13/09 | 18.953 | 44.31 | 20.111 | 26.082 |
| 11/14/09 | 18.953 | 44.31 | 20.111 | 26.082 |
| 11/15/09 | 18.953 | 44.31 | 20.111 | 26.082 |
| 11/16/09 | 18.953 | 44.31 | 20.111 | 26.082 |
| 11/17/09 | 18.953 | 44.31 | 20.111 | 26.082 |
| 11/18/09 | 18.953 | 44.31 | 20.111 | 26.082 |
| 11/19/09 | 19.766 | 40.02 | 18.211 | 23.012 |
| 11/20/09 | 19.766 | 40.02 | 18.211 | 23.012 |
| 11/21/09 | 19.766 | 40.02 | 18.211 | 23.012 |
| 11/22/09 | 19.766 | 40.02 | 18.211 | 23.012 |
| 11/23/09 | 19.766 | 40.02 | 18.211 | 23.012 |
| 11/24/09 | 19.766 | 40.02 | 18.211 | 23.012 |
| 11/25/09 | 19.766 | 40.02 | 18.211 | 23.012 |
| 11/26/09 | 19.766 | 40.02 | 18.211 | 23.012 |
| 11/27/09 | 19.766 | 40.02 | 18.211 | 23.012 |
| 11/28/09 | 19.766 | 40.02 | 18.211 | 23.012 |
| 11/29/09 | 19.766 | 40.02 | 18.211 | 23.012 |
| 11/30/09 | 19.766 | 40.02 | 18.211 | 23.012 |
| 12/1/09 | 19.766 | 40.02 | 18.211 | 23.012 |
| 12/2/09 | 19.766 | 40.02 | 18.211 | 23.012 |
| 12/3/09 | 19.408 | 36.845 | 12.15 | 17.429 |
| 12/4/09 | 19.408 | 36.845 | 12.15 | 17.429 |
| 12/5/09 | 19.408 | 36.845 | 12.15 | 17.429 |
| 12/6/09 | 19.408 | 36.845 | 12.15 | 17.429 |
| 12/7/09 | 19.408 | 36.845 | 12.15 | 17.429 |
| 12/8/09 | 19.408 | 36.845 | 12.15 | 17.429 |
| 12/9/09 | 19.408 | 36.845 | 12.15 | 17.429 |
| 12/10/09 | 19.408 | 36.845 | 12.15 | 17.429 |
| 12/11/09 | 19.408 | 36.845 | 12.15 | 17.429 |
| 12/12/09 | 19.408 | 36.845 | 12.15 | 17.429 |
| 12/13/09 | 19.408 | 36.845 | 12.15 | 17.429 |
| 12/14/09 | 19.408 | 36.845 | 12.15 | 17.429 |
| 12/15/09 | 19.408 | 36.845 | 12.15 | 17.429 |
| 12/16/09 | 19.408 | 36.845 | 12.15 | 17.429 |
| 12/17/09 | 14.109 | 36.495 | 12 | 13.314 |
| 12/18/09 | 14.109 | 36.495 | 12 | 13.314 |
| 12/19/09 | 14.109 | 36.495 | 12 | 13.314 |
| 12/20/09 | 14.109 | 36.495 | 12 | 13.314 |
| 12/21/09 | 14.109 | 36.495 | 12 | 13.314 |
| 12/22/09 | 14.109 | 36.495 | 12 | 13.314 |
| 12/23/09 | 14.109 | 36.495 | 12 | 13.314 |
| 12/24/09 | 14.109 | 36.495 | 12 | 13.314 |
| 12/25/09 | 14.109 | 36.495 | 12 | 13.314 |
| 12/26/09 | 14.109 | 36.495 | 12 | 13.314 |
| 12/27/09 | 14.109 | 36.495 | 12 | 13.314 |
| 12/28/09 | 14.109 | 36.495 | 12 | 13.314 |
| 12/29/09 | 14.109 | 36.495 | 12 | 13.314 |
| 12/30/09 | 14.109 | 36.495 | 12 | 13.314 |
| 12/31/09 | 14.109 | 36.495 | 12 | 13.314 |
| 1/1/10 | 14.109 | 36.495 | 12 | 13.314 |
| 1/2/10 | 14.109 | 36.495 | 12 | 13.314 |
| 1/3/10 | 14.109 | 36.495 | 12 | 13.314 |
| 1/4/10 | 14.109 | 36.495 | 12 | 13.314 |
| 1/5/10 | 14.109 | 36.495 | 12 | 13.314 |
| 1/6/10 | 14.109 | 36.495 | 12 | 13.314 |
| 1/7/10 | 14.109 | 36.495 | 12 | 13.314 |
| 1/8/10 | 14.109 | 36.495 | 12 | 13.314 |
| 1/9/10 | 14.109 | 36.495 | 12 | 13.314 |
| 1/10/10 | 14.109 | 36.495 | 12 | 13.314 |
| 1/11/10 | 14.109 | 36.495 | 12 | 13.314 |
| 1/12/10 | 14.109 | 36.495 | 12 | 13.314 |
| 1/13/10 | 14.109 | 36.495 | 12 | 13.314 |
| 1/14/10 | 9.78 | 10.885 | 7.5 | 10.366 |
| 1/15/10 | 9.78 | 10.885 | 7.5 | 10.366 |
| 1/16/10 | 9.78 | 10.885 | 7.5 | 10.366 |
| 1/17/10 | 9.78 | 10.885 | 7.5 | 10.366 |
| 1/18/10 | 9.78 | 10.885 | 7.5 | 10.366 |
| 1/19/10 | 9.78 | 10.885 | 7.5 | 10.366 |
| 1/20/10 | 9.78 | 10.885 | 7.5 | 10.366 |
| 1/21/10 | 9.78 | 10.885 | 7.5 | 10.366 |
| 1/22/10 | 9.78 | 10.885 | 7.5 | 10.366 |
| 1/23/10 | 9.78 | 10.885 | 7.5 | 10.366 |
| 1/24/10 | 9.78 | 10.885 | 7.5 | 10.366 |
| 1/25/10 | 9.78 | 10.885 | 7.5 | 10.366 |
| 1/26/10 | 9.78 | 10.885 | 7.5 | 10.366 |
| 1/27/10 | 9.78 | 10.885 | 7.5 | 10.366 |
| 1/28/10 | 9.78 | 10.885 | 7.5 | 10.366 |
| 1/29/10 | 9.78 | 10.885 | 7.5 | 10.366 |
| 1/30/10 | 9.78 | 10.885 | 7.5 | 10.366 |
| 1/31/10 | 9.78 | 10.885 | 7.5 | 10.366 |
| 2/1/10 | 9.78 | 10.885 | 7.5 | 10.366 |
| 2/2/10 | 9.78 | 10.885 | 7.5 | 10.366 |
| 2/3/10 | 9.78 | 10.885 | 7.5 | 10.366 |
| 2/4/10 | 9.78 | 10.885 | 7.5 | 10.366 |
| 2/5/10 | 9.78 | 10.885 | 7.5 | 10.366 |
| 2/6/10 | 9.78 | 10.885 | 7.5 | 10.366 |
| 2/7/10 | 9.78 | 10.885 | 7.5 | 10.366 |
| 2/8/10 | 9.78 | 10.885 | 7.5 | 10.366 |
| 2/9/10 | 9.78 | 10.885 | 7.5 | 10.366 |
| 2/10/10 | 9.78 | 10.885 | 7.5 | 10.366 |
| 2/11/10 | 4.595 | 6.505 | 0 | 4.326 |
| 2/12/10 | 4.595 | 6.505 | 0 | 4.326 |
| 2/13/10 | 4.595 | 6.505 | 0 | 4.326 |
| 2/14/10 | 4.595 | 6.505 | 0 | 4.326 |
| 2/15/10 | 4.595 | 6.505 | 0 | 4.326 |
| 2/16/10 | 4.595 | 6.505 | 0 | 4.326 |
| 2/17/10 | 4.595 | 6.505 | 0 | 4.326 |
| 2/18/10 | 4.595 | 6.505 | 0 | 4.326 |
| 2/19/10 | 4.595 | 6.505 | 0 | 4.326 |
| 2/20/10 | 4.595 | 6.505 | 0 | 4.326 |
| 2/21/10 | 4.595 | 6.505 | 0 | 4.326 |
| 2/22/10 | 4.595 | 6.505 | 0 | 4.326 |
| 2/23/10 | 4.595 | 6.505 | 0 | 4.326 |
| 2/24/10 | 4.595 | 6.505 | 0 | 4.326 |
| 2/25/10 | 4.595 | 6.505 | 0 | 4.326 |
| 2/26/10 | 4.595 | 6.505 | 0 | 4.326 |
| 2/27/10 | 4.595 | 6.505 | 0 | 4.326 |
| 2/28/10 | 4.595 | 6.505 | 0 | 4.326 |
| 3/1/10 | 4.595 | 6.505 | 0 | 4.326 |
| 3/2/10 | 4.595 | 6.505 | 0 | 4.326 |
| 3/3/10 | 4.595 | 6.505 | 0 | 4.326 |
| 3/4/10 | 4.595 | 6.505 | 0 | 4.326 |
| 3/5/10 | 4.595 | 6.505 | 0 | 4.326 |
| 3/6/10 | 4.595 | 6.505 | 0 | 4.326 |
| 3/7/10 | 4.595 | 6.505 | 0 | 4.326 |
| 3/8/10 | 4.595 | 6.505 | 0 | 4.326 |
| 3/9/10 | 4.595 | 6.505 | 0 | 4.326 |
| 3/10/10 | 4.595 | 6.505 | 0 | 4.326 |
| 3/11/10 | 1.565 | 1 | 0 | 0.845 |
| 3/12/10 | 1.565 | 1 | 0 | 0.845 |
| 3/13/10 | 1.565 | 1 | 0 | 0.845 |
| 3/14/10 | 1.565 | 1 | 0 | 0.845 |
| 3/15/10 | 1.565 | 1 | 0 | 0.845 |
| 3/16/10 | 1.565 | 1 | 0 | 0.845 |
| 3/17/10 | 1.565 | 1 | 0 | 0.845 |
| 3/18/10 | 1.565 | 1 | 0 | 0.845 |
| 3/19/10 | 1.565 | 1 | 0 | 0.845 |
| 3/20/10 | 1.565 | 1 | 0 | 0.845 |
| 3/21/10 | 1.565 | 1 | 0 | 0.845 |
| 3/22/10 | 1.565 | 1 | 0 | 0.845 |
| 3/23/10 | 1.565 | 1 | 0 | 0.845 |
| 3/24/10 | 1.565 | 1 | 0 | 0.845 |
| 3/25/10 | 1.565 | 1 | 0 | 0.845 |
| 3/26/10 | 1.565 | 1 | 0 | 0.845 |
| 3/27/10 | 1.565 | 1 | 0 | 0.845 |
| 3/28/10 | 1.565 | 1 | 0 | 0.845 |
| 3/29/10 | 1.565 | 1 | 0 | 0.845 |
| 3/30/10 | 1.565 | 1 | 0 | 0.845 |
| 3/31/10 | 1.565 | 1 | 0 | 0.845 |
| 4/1/10 | 1.565 | 1 | 0 | 0.845 |
| 4/2/10 | 1.565 | 1 | 0 | 0.845 |
| 4/3/10 | 1.565 | 1 | 0 | 0.845 |
| 4/4/10 | 1.565 | 1 | 0 | 0.845 |
| 4/5/10 | 1.565 | 1 | 0 | 0.845 |
| 4/6/10 | 1.565 | 1 | 0 | 0.845 |
| 4/7/10 | 1.565 | 1 | 0 | 0.845 |
| 4/8/10 | 0 | 0 | 0 | 0 |